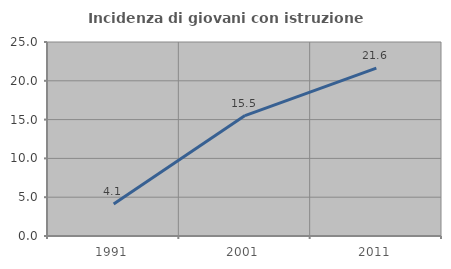
| Category | Incidenza di giovani con istruzione universitaria |
|---|---|
| 1991.0 | 4.124 |
| 2001.0 | 15.517 |
| 2011.0 | 21.637 |